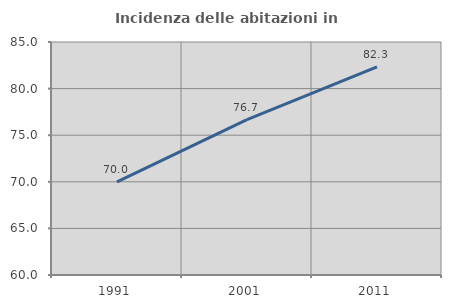
| Category | Incidenza delle abitazioni in proprietà  |
|---|---|
| 1991.0 | 69.988 |
| 2001.0 | 76.663 |
| 2011.0 | 82.323 |